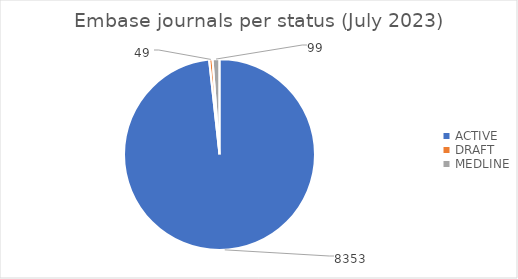
| Category | Embase journals per status (July 2023) |
|---|---|
| ACTIVE | 8353 |
| DRAFT | 49 |
| MEDLINE | 99 |